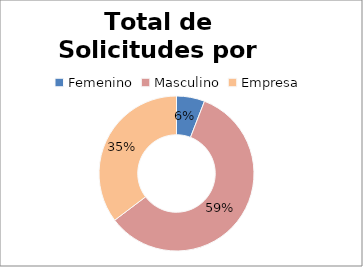
| Category | Series 0 |
|---|---|
| 0 | 1 |
| 1 | 10 |
| 2 | 6 |